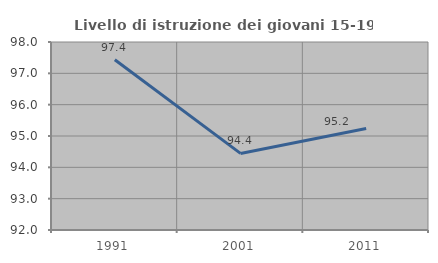
| Category | Livello di istruzione dei giovani 15-19 anni |
|---|---|
| 1991.0 | 97.436 |
| 2001.0 | 94.444 |
| 2011.0 | 95.238 |